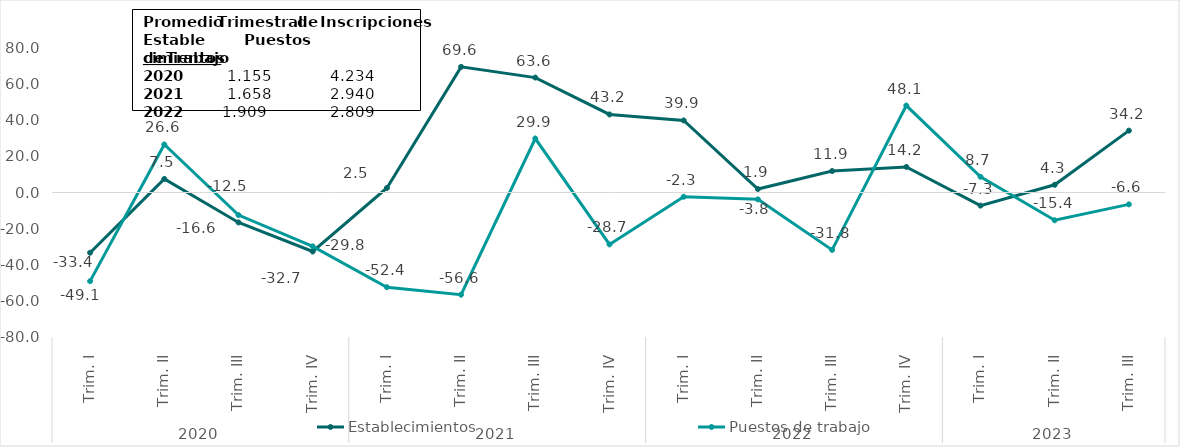
| Category | Establecimientos | Puestos de trabajo |
|---|---|---|
| 0 | -33.352 | -49.078 |
| 1 | 7.511 | 26.589 |
| 2 | -16.573 | -12.506 |
| 3 | -32.672 | -29.803 |
| 4 | 2.498 | -52.424 |
| 5 | 69.561 | -56.567 |
| 6 | 63.621 | 29.881 |
| 7 | 43.208 | -28.743 |
| 8 | 39.886 | -2.344 |
| 9 | 1.942 | -3.796 |
| 10 | 11.885 | -31.774 |
| 11 | 14.171 | 48.133 |
| 12 | -7.259 | 8.721 |
| 13 | 4.273 | -15.381 |
| 14 | 34.249 | -6.559 |